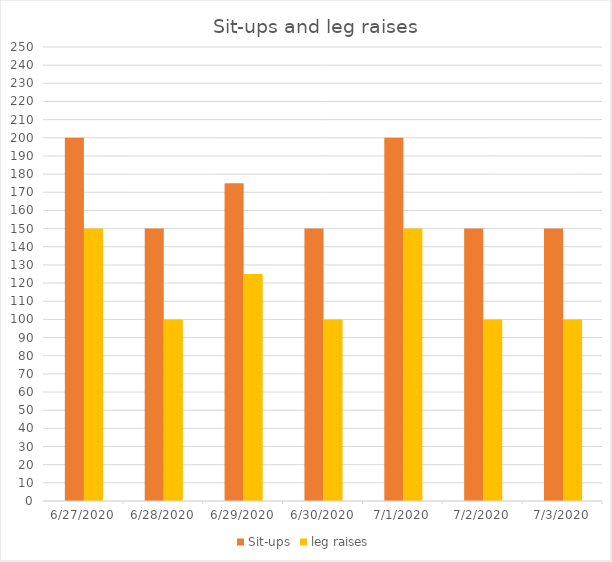
| Category | Sit-ups | leg raises |
|---|---|---|
| 6/27/20 | 200 | 150 |
| 6/28/20 | 150 | 100 |
| 6/29/20 | 175 | 125 |
| 6/30/20 | 150 | 100 |
| 7/1/20 | 200 | 150 |
| 7/2/20 | 150 | 100 |
| 7/3/20 | 150 | 100 |